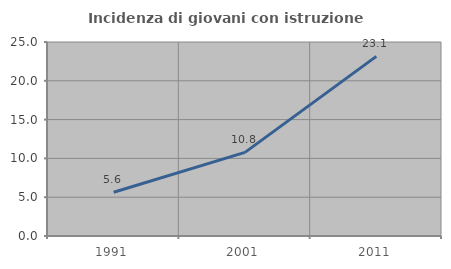
| Category | Incidenza di giovani con istruzione universitaria |
|---|---|
| 1991.0 | 5.644 |
| 2001.0 | 10.778 |
| 2011.0 | 23.145 |